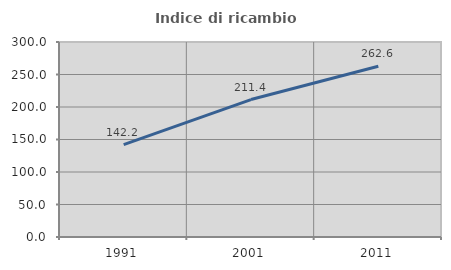
| Category | Indice di ricambio occupazionale  |
|---|---|
| 1991.0 | 142.222 |
| 2001.0 | 211.429 |
| 2011.0 | 262.637 |